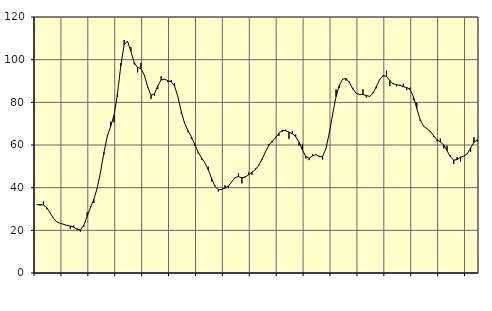
| Category | Piggar | Series 1 |
|---|---|---|
| nan | 31.9 | 32 |
| 87.0 | 31.5 | 32.09 |
| 87.0 | 33.5 | 31.84 |
| 87.0 | 29.9 | 30.66 |
| nan | 28.4 | 28.16 |
| 88.0 | 25.5 | 25.61 |
| 88.0 | 24 | 23.91 |
| 88.0 | 23.2 | 23.28 |
| nan | 23 | 22.83 |
| 89.0 | 22.2 | 22.31 |
| 89.0 | 20.7 | 22 |
| 89.0 | 22.3 | 21.5 |
| nan | 20.8 | 20.48 |
| 90.0 | 19.4 | 20.21 |
| 90.0 | 21.7 | 22.38 |
| 90.0 | 28.4 | 26.5 |
| nan | 31.3 | 30.73 |
| 91.0 | 32.8 | 34.6 |
| 91.0 | 39.6 | 39.81 |
| 91.0 | 47.7 | 47.47 |
| nan | 55.5 | 56.57 |
| 92.0 | 64.4 | 64.08 |
| 92.0 | 70.9 | 68.8 |
| 92.0 | 70.6 | 73.96 |
| nan | 82.6 | 83.82 |
| 93.0 | 98.4 | 97.02 |
| 93.0 | 109.2 | 106.95 |
| 93.0 | 108.5 | 108.73 |
| nan | 105.9 | 103.95 |
| 94.0 | 97.8 | 98.62 |
| 94.0 | 94 | 96.4 |
| 94.0 | 98.4 | 95.74 |
| nan | 92.9 | 92.78 |
| 95.0 | 86.9 | 87.21 |
| 95.0 | 81.6 | 83.26 |
| 95.0 | 83.1 | 83.99 |
| nan | 86.2 | 87.69 |
| 96.0 | 92.2 | 90.52 |
| 96.0 | 90.9 | 90.85 |
| 96.0 | 89.5 | 90.18 |
| nan | 90.5 | 89.58 |
| 97.0 | 89 | 87.57 |
| 97.0 | 82.4 | 82.52 |
| 97.0 | 74.6 | 75.61 |
| nan | 70 | 70.04 |
| 98.0 | 66 | 66.68 |
| 98.0 | 62.8 | 63.81 |
| 98.0 | 59.6 | 60.38 |
| nan | 56.1 | 56.63 |
| 99.0 | 53.2 | 53.98 |
| 99.0 | 51.7 | 51.64 |
| 99.0 | 49.8 | 48.45 |
| nan | 42.9 | 44.41 |
| 0.0 | 41 | 40.71 |
| 0.0 | 38.2 | 39.05 |
| 0.0 | 39.4 | 39.2 |
| nan | 41.1 | 39.79 |
| 1.0 | 39.7 | 40.76 |
| 1.0 | 42.7 | 42.72 |
| 1.0 | 45 | 44.76 |
| nan | 46.8 | 45.15 |
| 2.0 | 42 | 44.59 |
| 2.0 | 45.3 | 44.95 |
| 2.0 | 47.1 | 46.03 |
| nan | 46.1 | 47.2 |
| 3.0 | 49 | 48.44 |
| 3.0 | 50.7 | 50.41 |
| 3.0 | 53.1 | 53.33 |
| nan | 56.6 | 56.67 |
| 4.0 | 60.5 | 59.82 |
| 4.0 | 61.1 | 61.79 |
| 4.0 | 63.8 | 63.26 |
| nan | 64.3 | 65.44 |
| 5.0 | 66.1 | 66.86 |
| 5.0 | 67.2 | 66.67 |
| 5.0 | 62.9 | 66.06 |
| nan | 66.6 | 65.3 |
| 6.0 | 64.9 | 63.93 |
| 6.0 | 59.7 | 61.31 |
| 6.0 | 60.5 | 57.65 |
| nan | 53.7 | 54.65 |
| 7.0 | 52.9 | 53.77 |
| 7.0 | 55.7 | 54.91 |
| 7.0 | 55.3 | 55.53 |
| nan | 55 | 54.56 |
| 8.0 | 53.2 | 54.61 |
| 8.0 | 58.5 | 58.33 |
| 8.0 | 65.9 | 65.66 |
| nan | 74.3 | 74.46 |
| 9.0 | 86.1 | 82.71 |
| 9.0 | 86.8 | 88.13 |
| 9.0 | 90.9 | 90.91 |
| nan | 90.2 | 91.11 |
| 10.0 | 89.7 | 89.17 |
| 10.0 | 86.8 | 86.23 |
| 10.0 | 84.2 | 84.21 |
| nan | 83.6 | 83.7 |
| 11.0 | 86.1 | 83.67 |
| 11.0 | 82.3 | 83.16 |
| 11.0 | 82.6 | 82.81 |
| nan | 84.7 | 84.33 |
| 12.0 | 86.6 | 87.48 |
| 12.0 | 90.4 | 90.74 |
| 12.0 | 92.2 | 92.57 |
| nan | 94.9 | 92.12 |
| 13.0 | 87.6 | 90.18 |
| 13.0 | 89 | 88.63 |
| 13.0 | 87.5 | 88.33 |
| nan | 88.3 | 87.91 |
| 14.0 | 88.7 | 87.3 |
| 14.0 | 85.8 | 86.97 |
| 14.0 | 86.9 | 86 |
| nan | 81 | 82.68 |
| 15.0 | 79.8 | 77.19 |
| 15.0 | 71.3 | 71.94 |
| 15.0 | 68.8 | 68.86 |
| nan | 67.6 | 67.68 |
| 16.0 | 66 | 66.43 |
| 16.0 | 64 | 64.39 |
| 16.0 | 61.7 | 62.48 |
| nan | 63 | 61.41 |
| 17.0 | 58.4 | 60.08 |
| 17.0 | 59.7 | 57.34 |
| 17.0 | 55.1 | 54.42 |
| nan | 51.1 | 52.92 |
| 18.0 | 54.4 | 53.18 |
| 18.0 | 52.2 | 54.26 |
| 18.0 | 54.8 | 54.79 |
| nan | 56 | 55.89 |
| 19.0 | 56.8 | 58.58 |
| 19.0 | 63.6 | 61.27 |
| 19.0 | 61.7 | 62.43 |